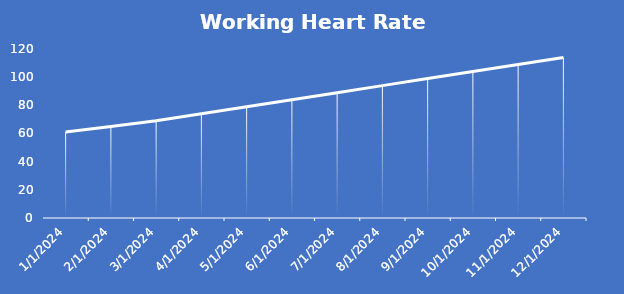
| Category | Working Heart Rate Reserve |
|---|---|
| 1/2/24 | 61 |
| 2/2/24 | 65 |
| 3/2/24 | 69 |
| 4/2/24 | 74 |
| 5/2/24 | 79 |
| 6/2/24 | 84 |
| 7/2/24 | 89 |
| 8/2/24 | 94 |
| 9/2/24 | 99 |
| 10/2/24 | 104 |
| 11/2/24 | 109 |
| 12/2/24 | 114 |